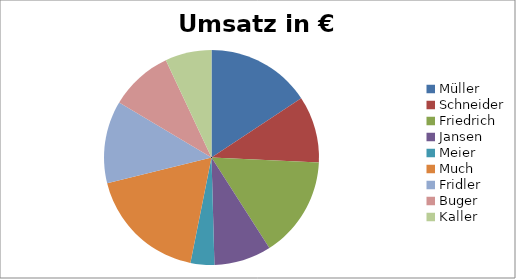
| Category | Umsatz in € 2013 |
|---|---|
| Müller | 53950 |
| Schneider | 34500 |
| Friedrich | 52230 |
| Jansen | 29580 |
| Meier | 12300 |
| Much | 61789 |
| Fridler | 42674 |
| Buger | 32500 |
| Kaller | 23980 |